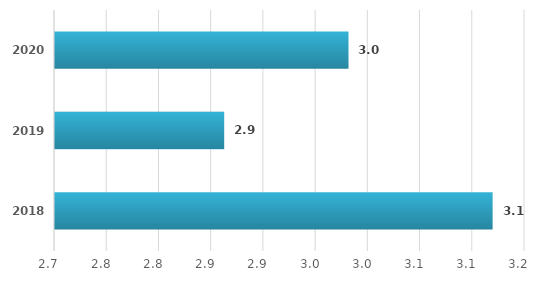
| Category | Series 0 |
|---|---|
| 2018.0 | 3.119 |
| 2019.0 | 2.862 |
| 2020.0 | 2.981 |